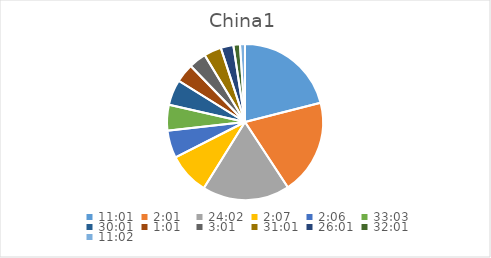
| Category | Series 0 |
|---|---|
| 0.4590277777777778 | 23.201 |
| 0.08402777777777777 | 21.729 |
| 1.0013888888888889 | 19.955 |
| 0.08819444444444445 | 9.519 |
| 0.08750000000000001 | 6.309 |
| 1.3770833333333332 | 5.888 |
| 1.2506944444444443 | 5.836 |
| 0.042361111111111106 | 4.288 |
| 0.12569444444444444 | 3.984 |
| 1.292361111111111 | 3.984 |
| 1.0840277777777778 | 2.885 |
| 1.3340277777777778 | 1.518 |
| 0.4597222222222222 | 1.134 |